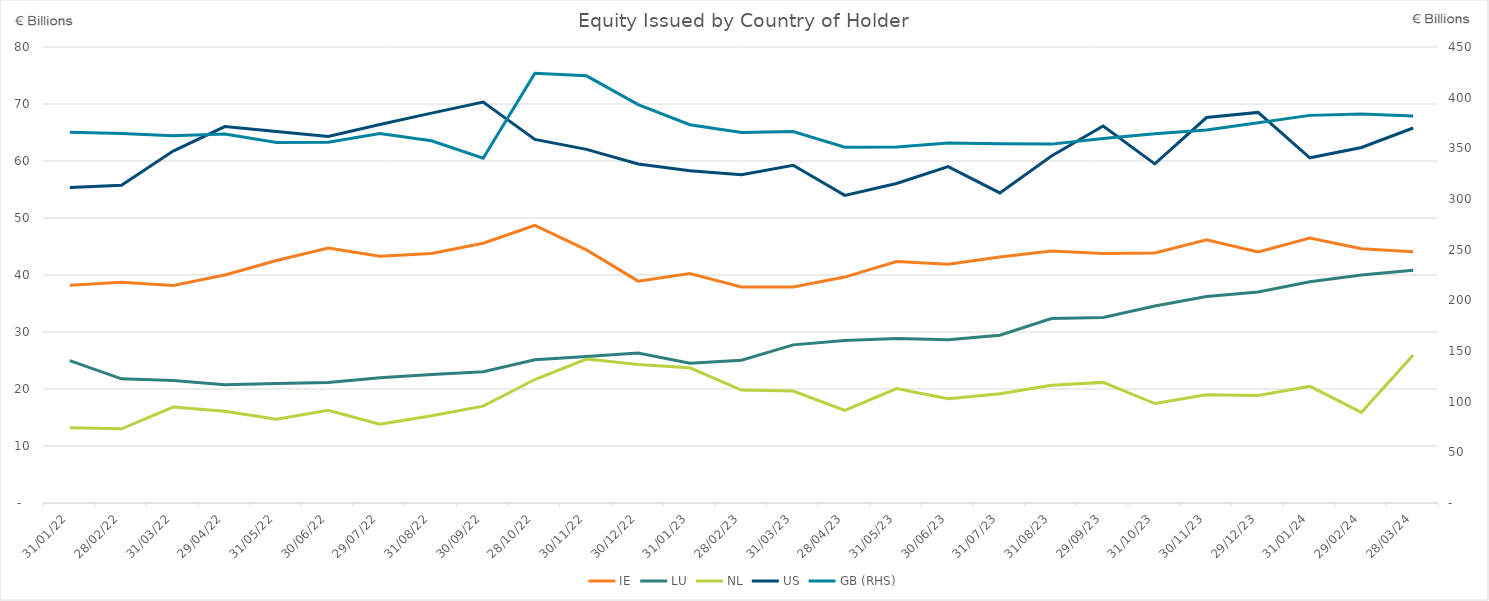
| Category | IE | LU | NL | US |
|---|---|---|---|---|
| 2022-01-31 | 38.188 | 24.98 | 13.2 | 55.338 |
| 2022-02-28 | 38.722 | 21.779 | 13.016 | 55.744 |
| 2022-03-31 | 38.166 | 21.502 | 16.839 | 61.736 |
| 2022-04-29 | 40.005 | 20.731 | 16.096 | 66.032 |
| 2022-05-31 | 42.553 | 20.969 | 14.714 | 65.157 |
| 2022-06-30 | 44.735 | 21.129 | 16.257 | 64.309 |
| 2022-07-29 | 43.293 | 21.984 | 13.815 | 66.414 |
| 2022-08-31 | 43.761 | 22.524 | 15.31 | 68.4 |
| 2022-09-30 | 45.579 | 23.046 | 16.99 | 70.341 |
| 2022-10-28 | 48.696 | 25.117 | 21.66 | 63.798 |
| 2022-11-30 | 44.406 | 25.709 | 25.244 | 62.036 |
| 2022-12-30 | 38.927 | 26.318 | 24.296 | 59.466 |
| 2023-01-31 | 40.264 | 24.511 | 23.726 | 58.294 |
| 2023-02-28 | 37.888 | 25.056 | 19.812 | 57.603 |
| 2023-03-31 | 37.89 | 27.744 | 19.647 | 59.25 |
| 2023-04-28 | 39.632 | 28.502 | 16.232 | 53.973 |
| 2023-05-31 | 42.363 | 28.865 | 20.084 | 56.058 |
| 2023-06-30 | 41.903 | 28.656 | 18.31 | 59 |
| 2023-07-31 | 43.157 | 29.446 | 19.17 | 54.4 |
| 2023-08-31 | 44.222 | 32.365 | 20.667 | 60.871 |
| 2023-09-29 | 43.777 | 32.557 | 21.162 | 66.149 |
| 2023-10-31 | 43.863 | 34.553 | 17.448 | 59.491 |
| 2023-11-30 | 46.188 | 36.21 | 18.998 | 67.628 |
| 2023-12-29 | 44.059 | 37.005 | 18.848 | 68.528 |
| 2024-01-31 | 46.494 | 38.805 | 20.47 | 60.556 |
| 2024-02-29 | 44.607 | 40.019 | 15.912 | 62.376 |
| 2024-03-28 | 44.077 | 40.842 | 25.969 | 65.792 |